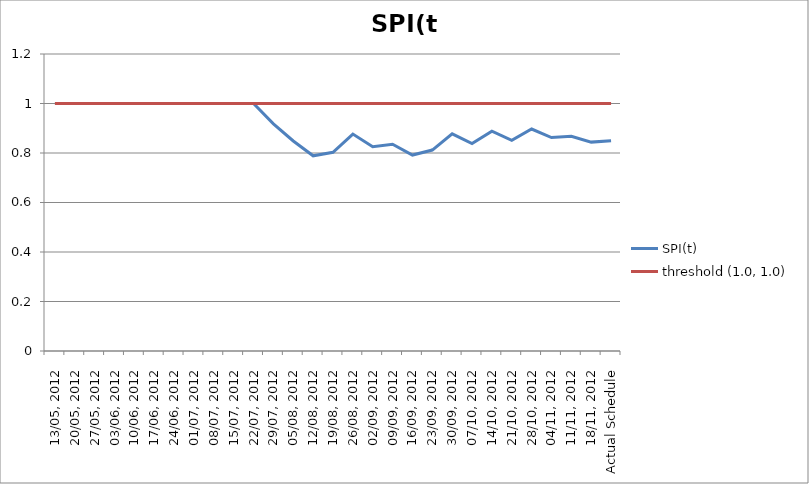
| Category | SPI(t) | threshold (1.0, 1.0) |
|---|---|---|
| 13/05, 2012 | 1 | 1 |
| 20/05, 2012 | 1 | 1 |
| 27/05, 2012 | 1 | 1 |
| 03/06, 2012 | 1 | 1 |
| 10/06, 2012 | 1 | 1 |
| 17/06, 2012 | 1 | 1 |
| 24/06, 2012 | 1 | 1 |
| 01/07, 2012 | 1 | 1 |
| 08/07, 2012 | 1 | 1 |
| 15/07, 2012 | 1 | 1 |
| 22/07, 2012 | 1 | 1 |
| 29/07, 2012 | 0.918 | 1 |
| 05/08, 2012 | 0.848 | 1 |
| 12/08, 2012 | 0.789 | 1 |
| 19/08, 2012 | 0.803 | 1 |
| 26/08, 2012 | 0.877 | 1 |
| 02/09, 2012 | 0.826 | 1 |
| 09/09, 2012 | 0.835 | 1 |
| 16/09, 2012 | 0.792 | 1 |
| 23/09, 2012 | 0.812 | 1 |
| 30/09, 2012 | 0.877 | 1 |
| 07/10, 2012 | 0.838 | 1 |
| 14/10, 2012 | 0.888 | 1 |
| 21/10, 2012 | 0.851 | 1 |
| 28/10, 2012 | 0.897 | 1 |
| 04/11, 2012 | 0.863 | 1 |
| 11/11, 2012 | 0.868 | 1 |
| 18/11, 2012 | 0.844 | 1 |
| Actual Schedule | 0.849 | 1 |